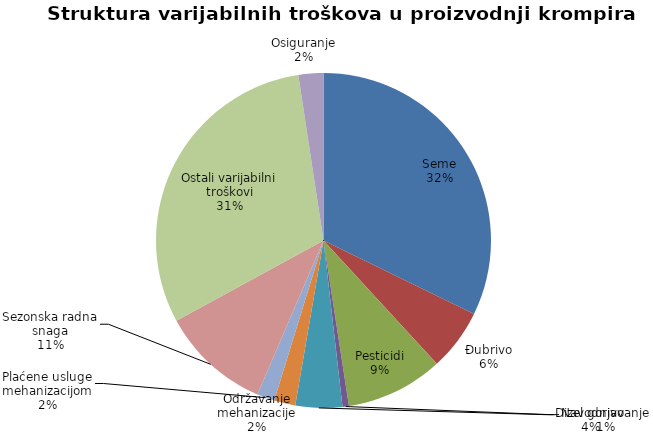
| Category | Series 0 |
|---|---|
| Seme | 114000 |
| Đubrivo | 21000 |
| Pesticidi | 33250 |
| Navodnjavanje | 2175 |
| Dizel gorivo | 15950 |
| Održavanje mehanizacije | 7278.333 |
| Plaćene usluge mehanizacijom | 6000 |
| Sezonska radna snaga | 37500 |
| Ostali varijabilni troškovi | 108000 |
| Osiguranje | 8500 |